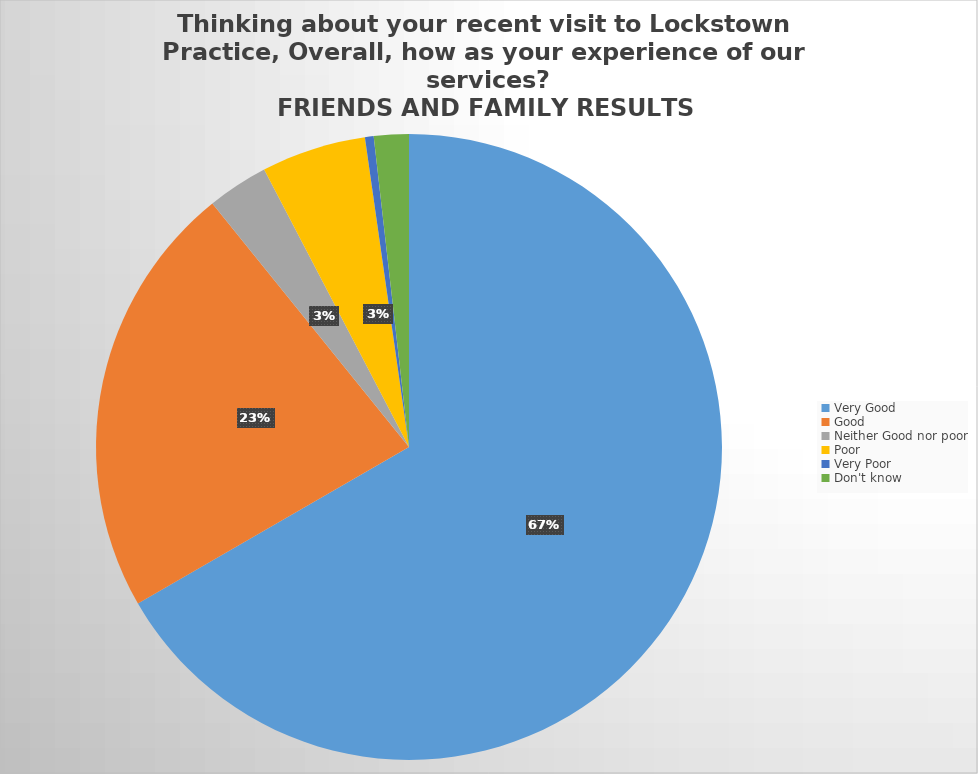
| Category | Responses |
|---|---|
| Very Good | 148 |
| Good | 50 |
| Neither Good nor poor | 7 |
| Poor | 12 |
| Very Poor | 1 |
| Don't know  | 4 |